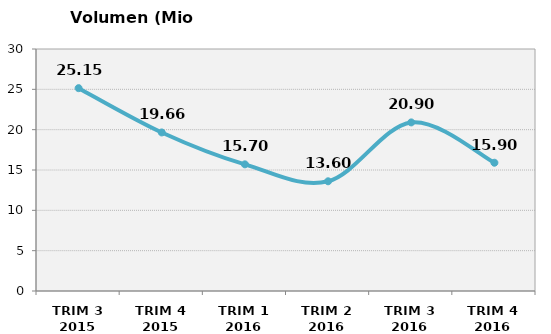
| Category | Volumen (Mio consumiciones) |
|---|---|
| TRIM 3 2015 | 25.147 |
| TRIM 4 2015 | 19.655 |
| TRIM 1 2016 | 15.7 |
| TRIM 2 2016 | 13.6 |
| TRIM 3 2016 | 20.9 |
| TRIM 4 2016 | 15.9 |